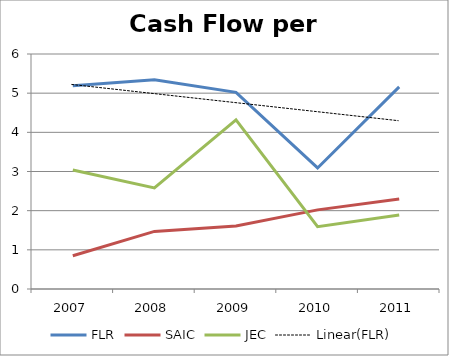
| Category | FLR | SAIC | JEC |
|---|---|---|---|
| 2007.0 | 5.19 | 0.85 | 3.04 |
| 2008.0 | 5.34 | 1.47 | 2.58 |
| 2009.0 | 5.02 | 1.61 | 4.32 |
| 2010.0 | 3.09 | 2.02 | 1.59 |
| 2011.0 | 5.16 | 2.3 | 1.89 |